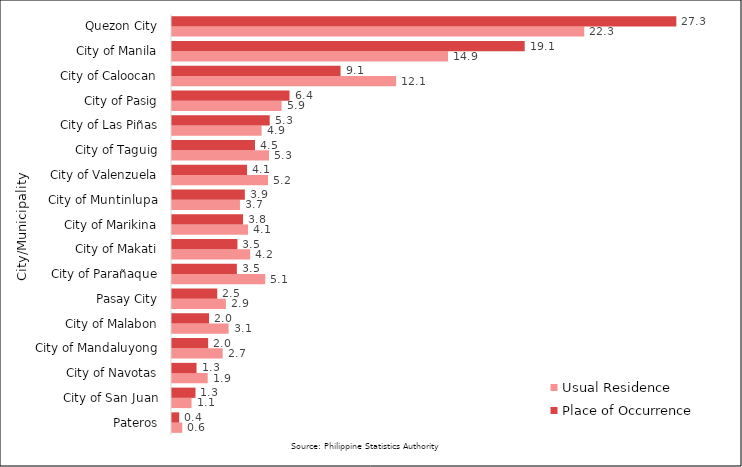
| Category | Usual Residence | Place of Occurrence |
|---|---|---|
|  Pateros | 0.557 | 0.388 |
|  City of San Juan | 1.059 | 1.272 |
|  City of Navotas | 1.934 | 1.328 |
|  City of Mandaluyong | 2.744 | 1.958 |
|  City of Malabon | 3.066 | 2.005 |
|  Pasay City | 2.917 | 2.45 |
|  City of Parañaque | 5.05 | 3.512 |
|  City of Makati | 4.231 | 3.544 |
|  City of Marikina | 4.118 | 3.847 |
|  City of Muntinlupa | 3.68 | 3.945 |
|  City of Valenzuela | 5.201 | 4.065 |
|  City of Taguig | 5.25 | 4.493 |
|  City of Las Piñas | 4.853 | 5.291 |
|  City of Pasig | 5.934 | 6.364 |
|  City of Caloocan | 12.138 | 9.128 |
|  City of Manila | 14.944 | 19.099 |
|  Quezon City | 22.324 | 27.311 |